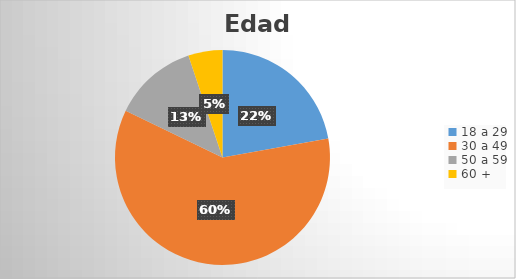
| Category | Series 0 |
|---|---|
| 18 a 29 | 82 |
| 30 a 49 | 222 |
| 50 a 59 | 47 |
| 60 + | 19 |